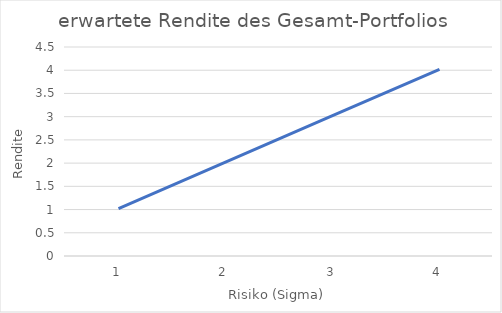
| Category | Series 0 |
|---|---|
| 1.0 | 1.02 |
| 2.0 | 2.02 |
| 3.0 | 3.02 |
| 4.0 | 4.02 |